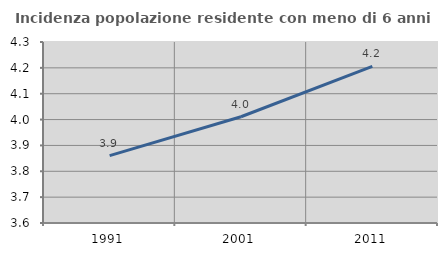
| Category | Incidenza popolazione residente con meno di 6 anni |
|---|---|
| 1991.0 | 3.861 |
| 2001.0 | 4.011 |
| 2011.0 | 4.206 |